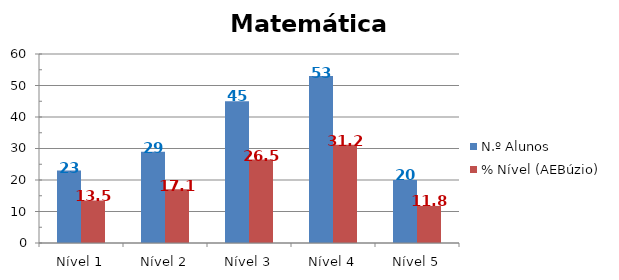
| Category | N.º Alunos | % Nível (AEBúzio) |
|---|---|---|
| Nível 1 | 23 | 13.529 |
| Nível 2 | 29 | 17.059 |
| Nível 3 | 45 | 26.471 |
| Nível 4 | 53 | 31.176 |
| Nível 5 | 20 | 11.765 |